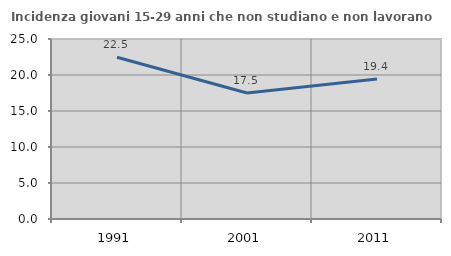
| Category | Incidenza giovani 15-29 anni che non studiano e non lavorano  |
|---|---|
| 1991.0 | 22.463 |
| 2001.0 | 17.5 |
| 2011.0 | 19.444 |